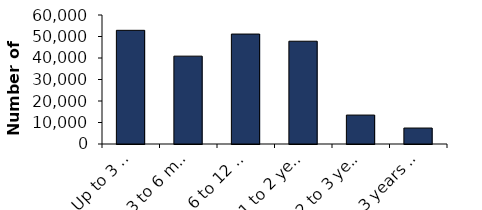
| Category | Series 1 |
|---|---|
| Up to 3 months | 52876 |
| 3 to 6 months | 40864 |
| 6 to 12 months | 51139 |
| 1 to 2 years | 47803 |
| 2 to 3 years | 13457 |
| 3 years & over | 7421 |